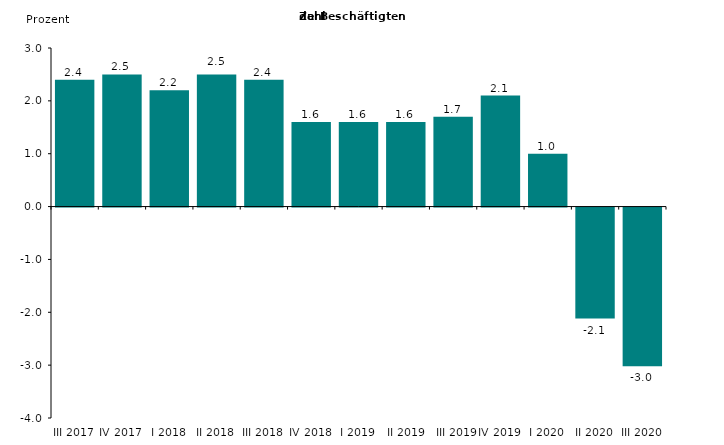
| Category | Series 0 |
|---|---|
| III 2017 | 2.4 |
| IV 2017 | 2.5 |
| I 2018 | 2.2 |
| II 2018 | 2.5 |
| III 2018 | 2.4 |
| IV 2018 | 1.6 |
| I 2019 | 1.6 |
|  II 2019 | 1.6 |
|  III 2019 | 1.7 |
| IV 2019 | 2.1 |
| I 2020 | 1 |
| II 2020 | -2.1 |
| III 2020 | -3 |